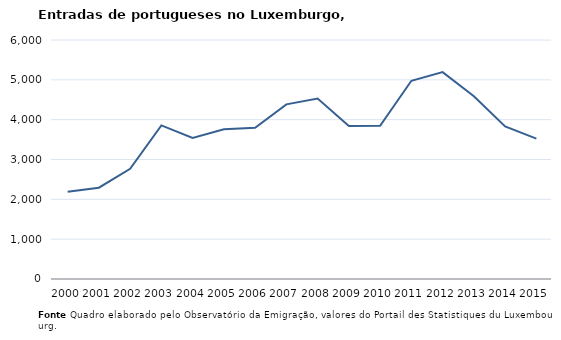
| Category | Entradas |
|---|---|
| 2000.0 | 2193 |
| 2001.0 | 2293 |
| 2002.0 | 2767 |
| 2003.0 | 3857 |
| 2004.0 | 3542 |
| 2005.0 | 3761 |
| 2006.0 | 3796 |
| 2007.0 | 4385 |
| 2008.0 | 4531 |
| 2009.0 | 3844 |
| 2010.0 | 3845 |
| 2011.0 | 4977 |
| 2012.0 | 5193 |
| 2013.0 | 4590 |
| 2014.0 | 3832 |
| 2015.0 | 3525 |